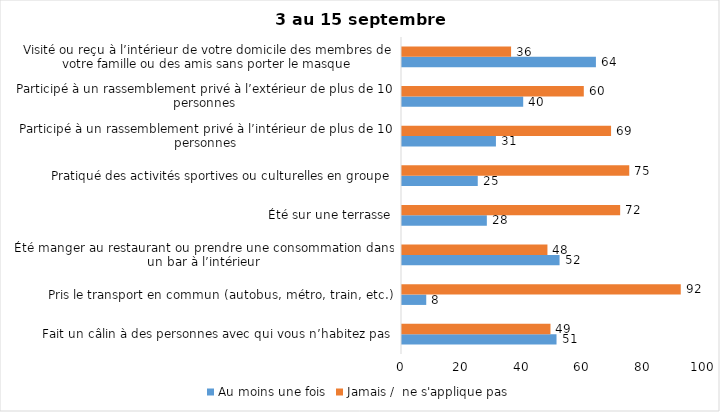
| Category | Au moins une fois | Jamais /  ne s'applique pas |
|---|---|---|
| Fait un câlin à des personnes avec qui vous n’habitez pas | 51 | 49 |
| Pris le transport en commun (autobus, métro, train, etc.) | 8 | 92 |
| Été manger au restaurant ou prendre une consommation dans un bar à l’intérieur | 52 | 48 |
| Été sur une terrasse | 28 | 72 |
| Pratiqué des activités sportives ou culturelles en groupe | 25 | 75 |
| Participé à un rassemblement privé à l’intérieur de plus de 10 personnes | 31 | 69 |
| Participé à un rassemblement privé à l’extérieur de plus de 10 personnes | 40 | 60 |
| Visité ou reçu à l’intérieur de votre domicile des membres de votre famille ou des amis sans porter le masque | 64 | 36 |